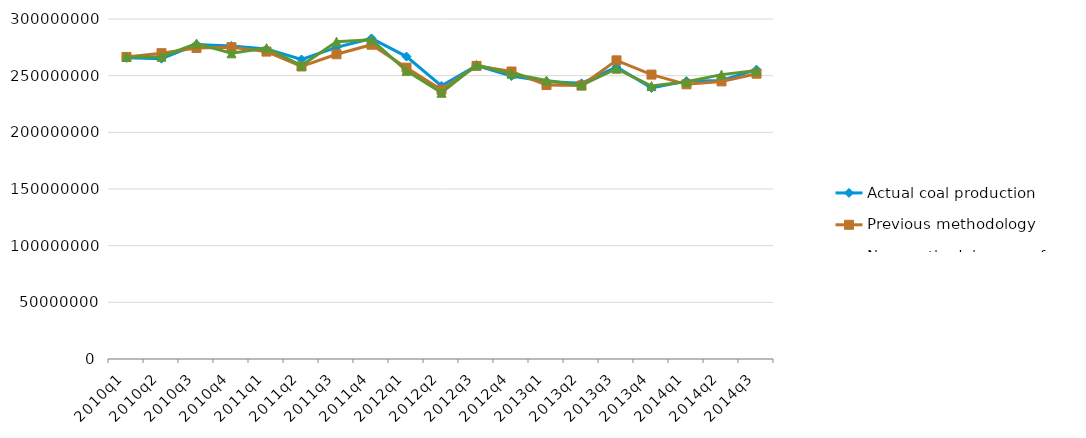
| Category | Actual coal production | Previous methodology | New methodology as of 1/8/15 |
|---|---|---|---|
| 2010q1 | 265702263 | 266524221 | 266441203 |
| 2010q2 | 264981602 | 269824017 | 266706183 |
| 2010q3 | 277504557 | 274462866 | 278372508 |
| 2010q4 | 276179726 | 275129296 | 269723143 |
| 2011q1 | 273478265 | 271237065 | 274311985 |
| 2011q2 | 264291015 | 258123363 | 258974185 |
| 2011q3 | 275005663 | 268906976 | 279974917 |
| 2011q4 | 282852593 | 277315654 | 281635684 |
| 2012q1 | 266864875 | 257082455 | 254261066 |
| 2012q2 | 241047063 | 237503507 | 234912357 |
| 2012q3 | 258955592 | 258616703 | 259451697 |
| 2012q4 | 249590888 | 253657006 | 251759245 |
| 2013q1 | 244866610 | 241715878 | 245686189 |
| 2013q2 | 243211172 | 241308315 | 241482674 |
| 2013q3 | 257594618 | 263509347 | 256161078 |
| 2013q4 | 239169379 | 250949957 | 240813749 |
| 2014q1 | 245186452 | 242361438 | 244631550 |
| 2014q2 | 245826728 | 244938882 | 250916231 |
| 2014q3 | 255319463 | 251743850 | 254533897 |